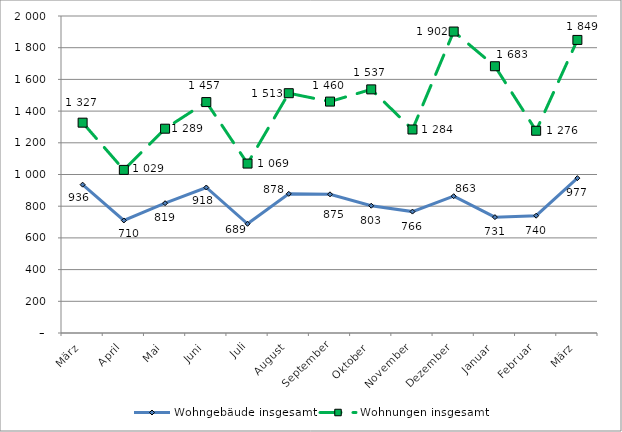
| Category | Wohngebäude insgesamt | Wohnungen insgesamt |
|---|---|---|
| März | 936 | 1327 |
| April | 710 | 1029 |
| Mai | 819 | 1289 |
| Juni | 918 | 1457 |
| Juli | 689 | 1069 |
| August | 878 | 1513 |
| September | 875 | 1460 |
| Oktober | 803 | 1537 |
| November | 766 | 1284 |
| Dezember | 863 | 1902 |
| Januar | 731 | 1683 |
| Februar | 740 | 1276 |
| März | 977 | 1849 |